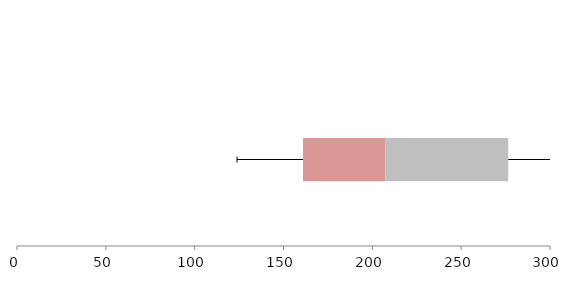
| Category | Series 1 | Series 2 | Series 3 |
|---|---|---|---|
| 0 | 160.975 | 46.426 | 69.094 |